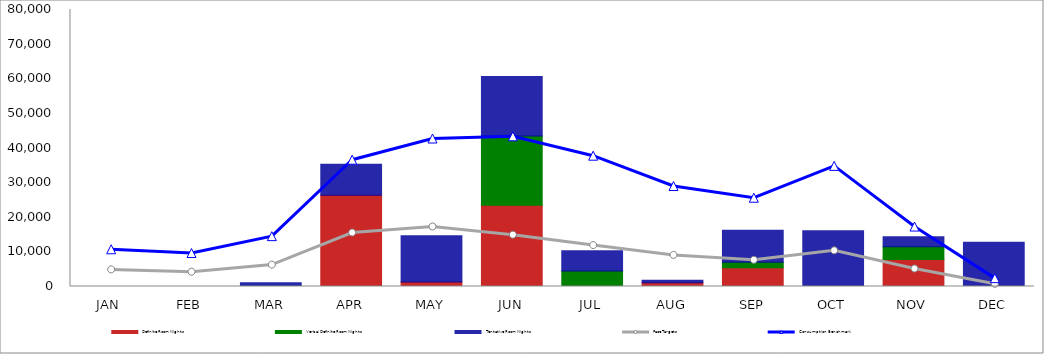
| Category | Definite Room Nights | Verbal Definite Room Nights | Tentative Room Nights |
|---|---|---|---|
| JAN | 0 | 0 | 0 |
| FEB | 0 | 0 | 0 |
| MAR | 0 | 0 | 1105 |
| APR | 26356 | 0 | 8938 |
| MAY | 1308 | 0 | 13337 |
| JUN | 23459 | 19975 | 17243 |
| JUL | 0 | 4474 | 5827 |
| AUG | 1056 | 0 | 750 |
| SEP | 5415 | 1570 | 9282 |
| OCT | 0 | 0 | 16095 |
| NOV | 7826 | 3670 | 2890 |
| DEC | 0 | 0 | 12780 |